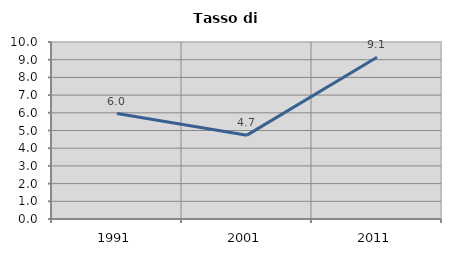
| Category | Tasso di disoccupazione   |
|---|---|
| 1991.0 | 5.96 |
| 2001.0 | 4.737 |
| 2011.0 | 9.135 |